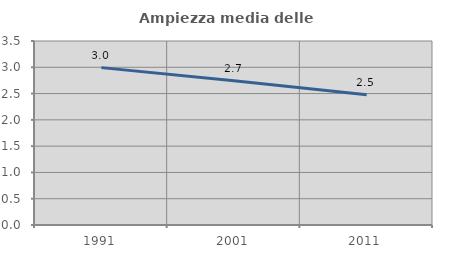
| Category | Ampiezza media delle famiglie |
|---|---|
| 1991.0 | 2.994 |
| 2001.0 | 2.744 |
| 2011.0 | 2.478 |